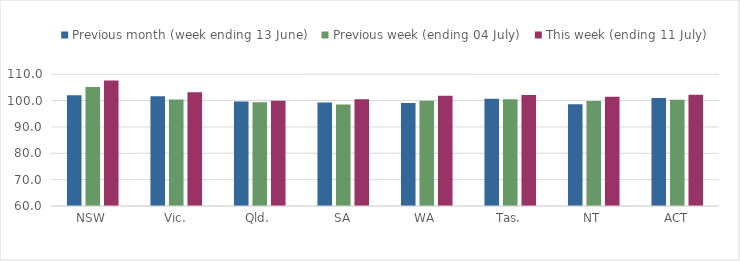
| Category | Previous month (week ending 13 June) | Previous week (ending 04 July) | This week (ending 11 July) |
|---|---|---|---|
| NSW | 101.995 | 105.171 | 107.576 |
| Vic. | 101.593 | 100.407 | 103.149 |
| Qld. | 99.656 | 99.354 | 99.959 |
| SA | 99.301 | 98.471 | 100.474 |
| WA | 99.076 | 99.936 | 101.836 |
| Tas. | 100.651 | 100.47 | 102.111 |
| NT | 98.61 | 99.815 | 101.433 |
| ACT | 100.951 | 100.317 | 102.216 |